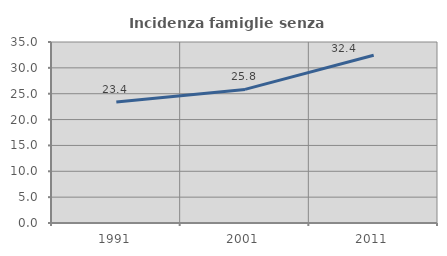
| Category | Incidenza famiglie senza nuclei |
|---|---|
| 1991.0 | 23.421 |
| 2001.0 | 25.838 |
| 2011.0 | 32.426 |